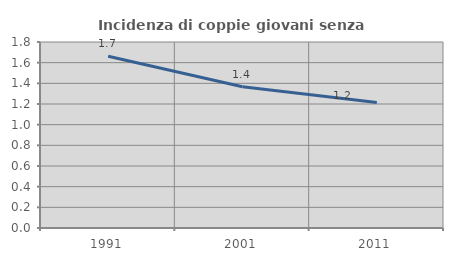
| Category | Incidenza di coppie giovani senza figli |
|---|---|
| 1991.0 | 1.662 |
| 2001.0 | 1.368 |
| 2011.0 | 1.215 |